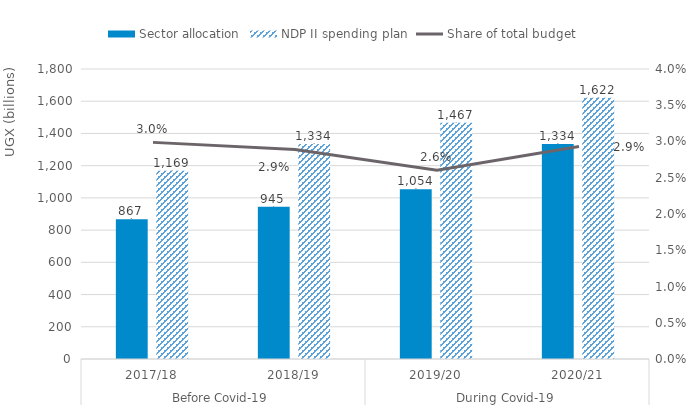
| Category | Sector allocation | NDP II spending plan |
|---|---|---|
| 0 | 866.76 | 1168.702 |
| 1 | 944.71 | 1334.165 |
| 2 | 1054.15 | 1466.97 |
| 3 | 1334 | 1621.547 |